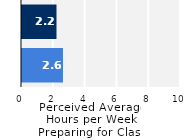
| Category | Series 0 |
|---|---|
| Upper Division | 2.577 |
| Lower Division | 2.169 |